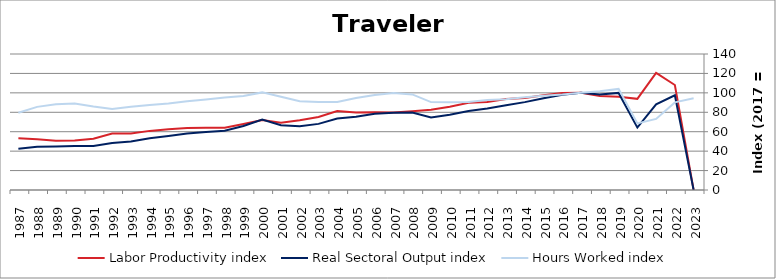
| Category | Labor Productivity index | Real Sectoral Output index | Hours Worked index |
|---|---|---|---|
| 2023.0 | 0 | 0 | 94.429 |
| 2022.0 | 108.069 | 97.476 | 90.198 |
| 2021.0 | 120.569 | 88.204 | 73.156 |
| 2020.0 | 93.832 | 64.33 | 68.558 |
| 2019.0 | 96.023 | 99.945 | 104.085 |
| 2018.0 | 96.774 | 98.273 | 101.548 |
| 2017.0 | 100 | 100 | 100 |
| 2016.0 | 99.852 | 98.102 | 98.248 |
| 2015.0 | 97.504 | 94.514 | 96.933 |
| 2014.0 | 94.677 | 90.454 | 95.539 |
| 2013.0 | 93.582 | 87.348 | 93.339 |
| 2012.0 | 90.583 | 83.886 | 92.606 |
| 2011.0 | 89.729 | 81.362 | 90.675 |
| 2010.0 | 85.797 | 77.43 | 90.248 |
| 2009.0 | 82.587 | 74.707 | 90.458 |
| 2008.0 | 81.065 | 79.758 | 98.388 |
| 2007.0 | 79.685 | 79.599 | 99.892 |
| 2006.0 | 80.144 | 78.412 | 97.839 |
| 2005.0 | 79.685 | 75.496 | 94.743 |
| 2004.0 | 81.226 | 73.508 | 90.499 |
| 2003.0 | 75.199 | 68.07 | 90.52 |
| 2002.0 | 71.807 | 65.672 | 91.457 |
| 2001.0 | 69.303 | 66.571 | 96.058 |
| 2000.0 | 72.068 | 72.412 | 100.477 |
| 1999.0 | 67.96 | 65.815 | 96.844 |
| 1998.0 | 64.136 | 61.104 | 95.272 |
| 1997.0 | 64.004 | 59.668 | 93.225 |
| 1996.0 | 63.729 | 58.166 | 91.271 |
| 1995.0 | 62.572 | 55.672 | 88.973 |
| 1994.0 | 60.856 | 53.253 | 87.505 |
| 1993.0 | 58.225 | 49.833 | 85.588 |
| 1992.0 | 58.072 | 48.404 | 83.352 |
| 1991.0 | 52.741 | 45.34 | 85.969 |
| 1990.0 | 50.89 | 45.316 | 89.047 |
| 1989.0 | 50.759 | 44.799 | 88.257 |
| 1988.0 | 52.127 | 44.615 | 85.59 |
| 1987.0 | 53.328 | 42.4 | 79.507 |